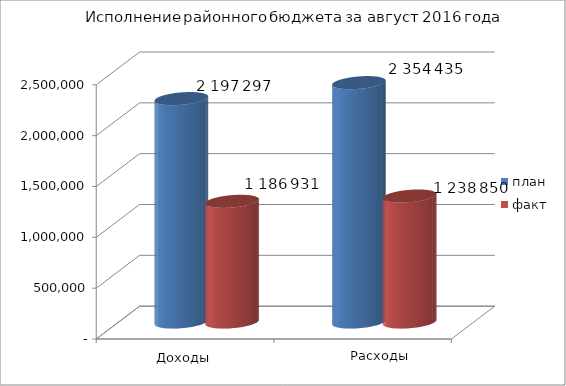
| Category | план | факт |
|---|---|---|
| 0 | 2197297 | 1186931 |
| 1 | 2354435 | 1238850 |